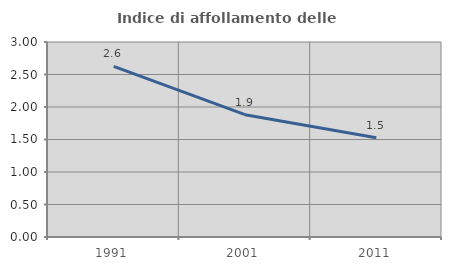
| Category | Indice di affollamento delle abitazioni  |
|---|---|
| 1991.0 | 2.625 |
| 2001.0 | 1.882 |
| 2011.0 | 1.526 |